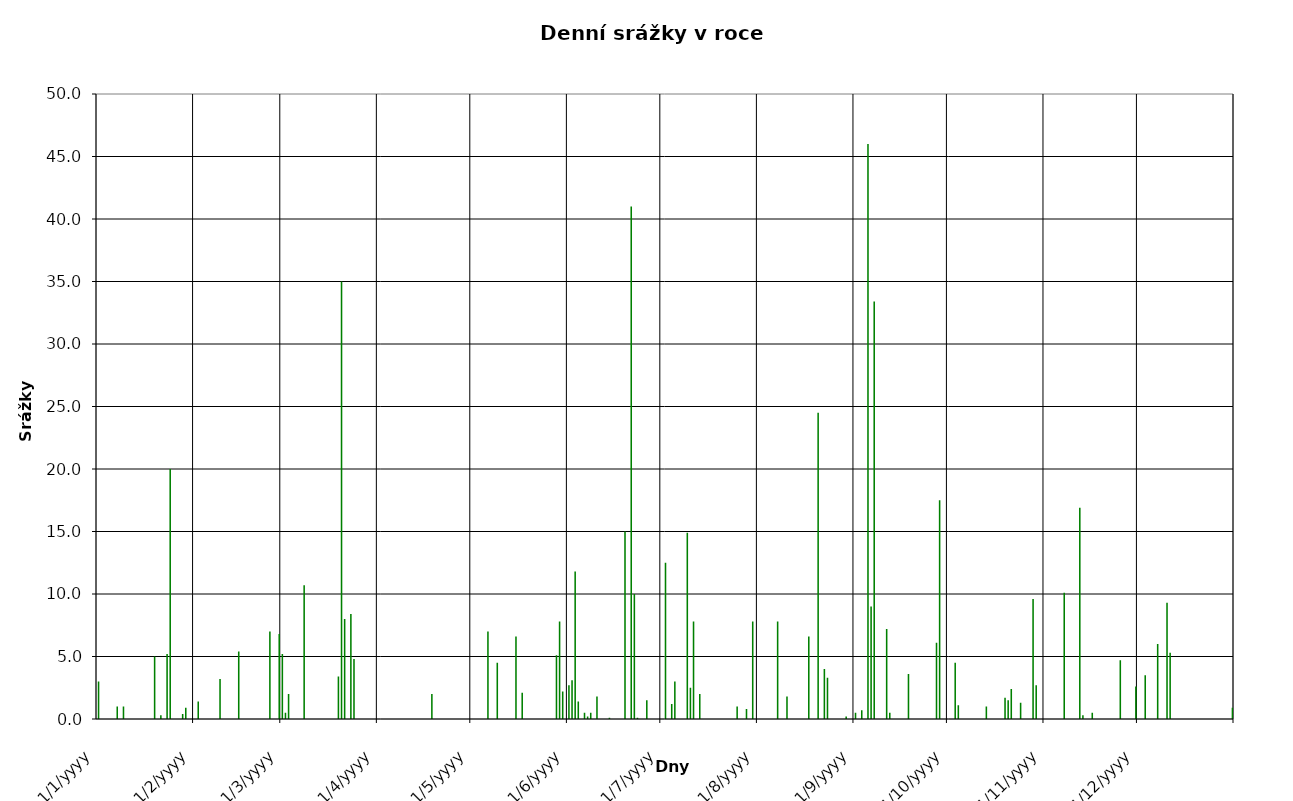
| Category | Series 0 |
|---|---|
| 2007-01-01 | 3 |
| 2007-01-02 | 0 |
| 2007-01-03 | 0 |
| 2007-01-04 | 0 |
| 2007-01-05 | 0 |
| 2007-01-06 | 0 |
| 2007-01-07 | 1 |
| 2007-01-08 | 0 |
| 2007-01-09 | 1 |
| 2007-01-10 | 0 |
| 2007-01-11 | 0 |
| 2007-01-12 | 0 |
| 2007-01-13 | 0 |
| 2007-01-14 | 0 |
| 2007-01-15 | 0 |
| 2007-01-16 | 0 |
| 2007-01-17 | 0 |
| 2007-01-18 | 0 |
| 2007-01-19 | 5 |
| 2007-01-20 | 0 |
| 2007-01-21 | 0.3 |
| 2007-01-22 | 0 |
| 2007-01-23 | 5.2 |
| 2007-01-24 | 20 |
| 2007-01-25 | 0 |
| 2007-01-26 | 0 |
| 2007-01-27 | 0 |
| 2007-01-28 | 0.4 |
| 2007-01-29 | 0.9 |
| 2007-01-30 | 0 |
| 2007-01-31 | 0 |
| 2007-02-01 | 0 |
| 2007-02-02 | 1.4 |
| 2007-02-03 | 0 |
| 2007-02-04 | 0 |
| 2007-02-05 | 0 |
| 2007-02-06 | 0 |
| 2007-02-07 | 0 |
| 2007-02-08 | 0 |
| 2007-02-09 | 3.2 |
| 2007-02-10 | 0 |
| 2007-02-11 | 0 |
| 2007-02-12 | 0 |
| 2007-02-13 | 0 |
| 2007-02-14 | 0 |
| 2007-02-15 | 5.4 |
| 2007-02-16 | 0 |
| 2007-02-17 | 0 |
| 2007-02-18 | 0 |
| 2007-02-19 | 0 |
| 2007-02-20 | 0 |
| 2007-02-21 | 0 |
| 2007-02-22 | 0 |
| 2007-02-23 | 0 |
| 2007-02-24 | 0 |
| 2007-02-25 | 7 |
| 2007-02-26 | 0 |
| 2007-02-27 | 0 |
| 2007-02-28 | 6.8 |
| 2007-03-01 | 5.2 |
| 2007-03-02 | 0.5 |
| 2007-03-03 | 2 |
| 2007-03-04 | 0 |
| 2007-03-05 | 0 |
| 2007-03-06 | 0 |
| 2007-03-07 | 0 |
| 2007-03-08 | 10.7 |
| 2007-03-09 | 0 |
| 2007-03-10 | 0 |
| 2007-03-11 | 0 |
| 2007-03-12 | 0 |
| 2007-03-13 | 0 |
| 2007-03-14 | 0 |
| 2007-03-15 | 0 |
| 2007-03-16 | 0 |
| 2007-03-17 | 0 |
| 2007-03-18 | 0 |
| 2007-03-19 | 3.4 |
| 2007-03-20 | 35 |
| 2007-03-21 | 8 |
| 2007-03-22 | 0 |
| 2007-03-23 | 8.4 |
| 2007-03-24 | 4.8 |
| 2007-03-25 | 0 |
| 2007-03-26 | 0 |
| 2007-03-27 | 0 |
| 2007-03-28 | 0 |
| 2007-03-29 | 0 |
| 2007-03-30 | 0 |
| 2007-03-31 | 0 |
| 2007-04-01 | 0 |
| 2007-04-02 | 0 |
| 2007-04-03 | 0 |
| 2007-04-04 | 0 |
| 2007-04-05 | 0 |
| 2007-04-06 | 0 |
| 2007-04-07 | 0 |
| 2007-04-08 | 0 |
| 2007-04-09 | 0 |
| 2007-04-10 | 0 |
| 2007-04-11 | 0 |
| 2007-04-12 | 0 |
| 2007-04-13 | 0 |
| 2007-04-14 | 0 |
| 2007-04-15 | 0 |
| 2007-04-16 | 0 |
| 2007-04-17 | 0 |
| 2007-04-18 | 2 |
| 2007-04-19 | 0 |
| 2007-04-20 | 0 |
| 2007-04-21 | 0 |
| 2007-04-22 | 0 |
| 2007-04-23 | 0 |
| 2007-04-24 | 0 |
| 2007-04-25 | 0 |
| 2007-04-26 | 0 |
| 2007-04-27 | 0 |
| 2007-04-28 | 0 |
| 2007-04-29 | 0 |
| 2007-04-30 | 0 |
| 2007-05-01 | 0 |
| 2007-05-02 | 0 |
| 2007-05-03 | 0 |
| 2007-05-04 | 0 |
| 2007-05-05 | 0 |
| 2007-05-06 | 7 |
| 2007-05-07 | 0 |
| 2007-05-08 | 0 |
| 2007-05-09 | 4.5 |
| 2007-05-10 | 0 |
| 2007-05-11 | 0 |
| 2007-05-12 | 0 |
| 2007-05-13 | 0 |
| 2007-05-14 | 0 |
| 2007-05-15 | 6.6 |
| 2007-05-16 | 0 |
| 2007-05-17 | 2.1 |
| 2007-05-18 | 0 |
| 2007-05-19 | 0 |
| 2007-05-20 | 0 |
| 2007-05-21 | 0 |
| 2007-05-22 | 0 |
| 2007-05-23 | 0 |
| 2007-05-24 | 0 |
| 2007-05-25 | 0 |
| 2007-05-26 | 0 |
| 2007-05-27 | 0 |
| 2007-05-28 | 5.1 |
| 2007-05-29 | 7.8 |
| 2007-05-30 | 2.2 |
| 2007-05-31 | 0 |
| 2007-06-01 | 2.7 |
| 2007-06-02 | 3.1 |
| 2007-06-03 | 11.8 |
| 2007-06-04 | 1.4 |
| 2007-06-05 | 0 |
| 2007-06-06 | 0.5 |
| 2007-06-07 | 0.2 |
| 2007-06-08 | 0.5 |
| 2007-06-09 | 0 |
| 2007-06-10 | 1.8 |
| 2007-06-11 | 0 |
| 2007-06-12 | 0 |
| 2007-06-13 | 0 |
| 2007-06-14 | 0.1 |
| 2007-06-15 | 0 |
| 2007-06-16 | 0 |
| 2007-06-17 | 0 |
| 2007-06-18 | 0 |
| 2007-06-19 | 15 |
| 2007-06-20 | 0 |
| 2007-06-21 | 41 |
| 2007-06-22 | 10 |
| 2007-06-23 | 0.1 |
| 2007-06-24 | 0 |
| 2007-06-25 | 0 |
| 2007-06-26 | 1.5 |
| 2007-06-27 | 0 |
| 2007-06-28 | 0 |
| 2007-06-29 | 0 |
| 2007-06-30 | 0 |
| 2007-07-01 | 0 |
| 2007-07-02 | 12.5 |
| 2007-07-03 | 0 |
| 2007-07-04 | 1.2 |
| 2007-07-05 | 3 |
| 2007-07-06 | 0 |
| 2007-07-07 | 0 |
| 2007-07-08 | 0 |
| 2007-07-09 | 14.9 |
| 2007-07-10 | 2.5 |
| 2007-07-11 | 7.8 |
| 2007-07-12 | 0 |
| 2007-07-13 | 2 |
| 2007-07-14 | 0 |
| 2007-07-15 | 0 |
| 2007-07-16 | 0 |
| 2007-07-17 | 0 |
| 2007-07-18 | 0 |
| 2007-07-19 | 0 |
| 2007-07-20 | 0 |
| 2007-07-21 | 0 |
| 2007-07-22 | 0 |
| 2007-07-23 | 0 |
| 2007-07-24 | 0 |
| 2007-07-25 | 1 |
| 2007-07-26 | 0 |
| 2007-07-27 | 0 |
| 2007-07-28 | 0.8 |
| 2007-07-29 | 0 |
| 2007-07-30 | 7.8 |
| 2007-07-31 | 0 |
| 2007-08-01 | 0 |
| 2007-08-02 | 0 |
| 2007-08-03 | 0 |
| 2007-08-04 | 0 |
| 2007-08-05 | 0 |
| 2007-08-06 | 0 |
| 2007-08-07 | 7.8 |
| 2007-08-08 | 0 |
| 2007-08-09 | 0 |
| 2007-08-10 | 1.8 |
| 2007-08-11 | 0 |
| 2007-08-12 | 0 |
| 2007-08-13 | 0 |
| 2007-08-14 | 0 |
| 2007-08-15 | 0 |
| 2007-08-16 | 0 |
| 2007-08-17 | 6.6 |
| 2007-08-18 | 0 |
| 2007-08-19 | 0 |
| 2007-08-20 | 24.5 |
| 2007-08-21 | 0 |
| 2007-08-22 | 4 |
| 2007-08-23 | 3.3 |
| 2007-08-24 | 0 |
| 2007-08-25 | 0 |
| 2007-08-26 | 0 |
| 2007-08-27 | 0 |
| 2007-08-28 | 0 |
| 2007-08-29 | 0.2 |
| 2007-08-30 | 0 |
| 2007-08-31 | 0 |
| 2007-09-01 | 0.5 |
| 2007-09-02 | 0 |
| 2007-09-03 | 0.7 |
| 2007-09-04 | 0 |
| 2007-09-05 | 46 |
| 2007-09-06 | 9 |
| 2007-09-07 | 33.4 |
| 2007-09-08 | 0 |
| 2007-09-09 | 0 |
| 2007-09-10 | 0 |
| 2007-09-11 | 7.2 |
| 2007-09-12 | 0.5 |
| 2007-09-13 | 0 |
| 2007-09-14 | 0 |
| 2007-09-15 | 0 |
| 2007-09-16 | 0 |
| 2007-09-17 | 0 |
| 2007-09-18 | 3.6 |
| 2007-09-19 | 0 |
| 2007-09-20 | 0 |
| 2007-09-21 | 0 |
| 2007-09-22 | 0 |
| 2007-09-23 | 0 |
| 2007-09-24 | 0 |
| 2007-09-25 | 0 |
| 2007-09-26 | 0 |
| 2007-09-27 | 6.1 |
| 2007-09-28 | 17.5 |
| 2007-09-29 | 0 |
| 2007-09-30 | 0 |
| 2007-10-01 | 0 |
| 2007-10-02 | 0 |
| 2007-10-03 | 4.5 |
| 2007-10-04 | 1.1 |
| 2007-10-05 | 0 |
| 2007-10-06 | 0 |
| 2007-10-07 | 0 |
| 2007-10-08 | 0 |
| 2007-10-09 | 0 |
| 2007-10-10 | 0 |
| 2007-10-11 | 0 |
| 2007-10-12 | 0 |
| 2007-10-13 | 1 |
| 2007-10-14 | 0 |
| 2007-10-15 | 0 |
| 2007-10-16 | 0 |
| 2007-10-17 | 0 |
| 2007-10-18 | 0 |
| 2007-10-19 | 1.7 |
| 2007-10-20 | 1.5 |
| 2007-10-21 | 2.4 |
| 2007-10-22 | 0 |
| 2007-10-23 | 0 |
| 2007-10-24 | 1.3 |
| 2007-10-25 | 0 |
| 2007-10-26 | 0 |
| 2007-10-27 | 0 |
| 2007-10-28 | 9.6 |
| 2007-10-29 | 2.7 |
| 2007-10-30 | 0 |
| 2007-10-31 | 0 |
| 2007-11-01 | 0 |
| 2007-11-02 | 0 |
| 2007-11-03 | 0 |
| 2007-11-04 | 0 |
| 2007-11-05 | 0 |
| 2007-11-06 | 0 |
| 2007-11-07 | 10.1 |
| 2007-11-08 | 0 |
| 2007-11-09 | 0 |
| 2007-11-10 | 0 |
| 2007-11-11 | 0 |
| 2007-11-12 | 16.9 |
| 2007-11-13 | 0.3 |
| 2007-11-14 | 0 |
| 2007-11-15 | 0 |
| 2007-11-16 | 0.5 |
| 2007-11-17 | 0 |
| 2007-11-18 | 0 |
| 2007-11-19 | 0 |
| 2007-11-20 | 0 |
| 2007-11-21 | 0 |
| 2007-11-22 | 0 |
| 2007-11-23 | 0 |
| 2007-11-24 | 0 |
| 2007-11-25 | 4.7 |
| 2007-11-26 | 0 |
| 2007-11-27 | 0 |
| 2007-11-28 | 0 |
| 2007-11-29 | 0 |
| 2007-11-30 | 2.6 |
| 2007-12-01 | 0 |
| 2007-12-02 | 0 |
| 2007-12-03 | 3.5 |
| 2007-12-04 | 0 |
| 2007-12-05 | 0 |
| 2007-12-06 | 0 |
| 2007-12-07 | 6 |
| 2007-12-08 | 0 |
| 2007-12-09 | 0 |
| 2007-12-10 | 9.3 |
| 2007-12-11 | 5.3 |
| 2007-12-12 | 0 |
| 2007-12-13 | 0 |
| 2007-12-14 | 0 |
| 2007-12-15 | 0 |
| 2007-12-16 | 0 |
| 2007-12-17 | 0 |
| 2007-12-18 | 0 |
| 2007-12-19 | 0 |
| 2007-12-20 | 0 |
| 2007-12-21 | 0 |
| 2007-12-22 | 0 |
| 2007-12-23 | 0 |
| 2007-12-24 | 0 |
| 2007-12-25 | 0 |
| 2007-12-26 | 0 |
| 2007-12-27 | 0 |
| 2007-12-28 | 0 |
| 2007-12-29 | 0 |
| 2007-12-30 | 0 |
| 2007-12-31 | 0.9 |